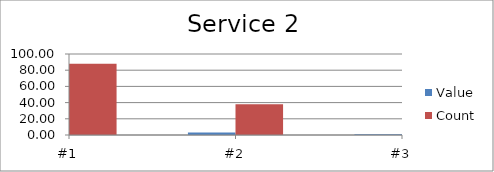
| Category | Value | Count |
|---|---|---|
| #1 | 5 | 88 |
| #2 | 3 | 38 |
| #3 | 1 | 32 |